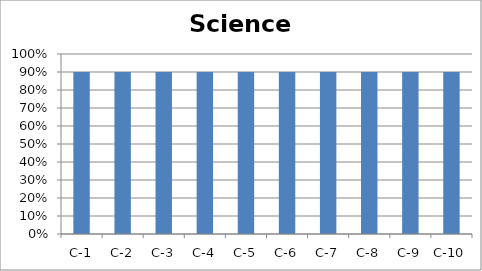
| Category | Science |
|---|---|
| C-1 | 0.9 |
| C-2 | 0.9 |
| C-3 | 0.9 |
| C-4 | 0.9 |
| C-5 | 0.9 |
| C-6 | 0.9 |
| C-7 | 0.9 |
| C-8 | 0.9 |
| C-9 | 0.9 |
| C-10 | 0.9 |